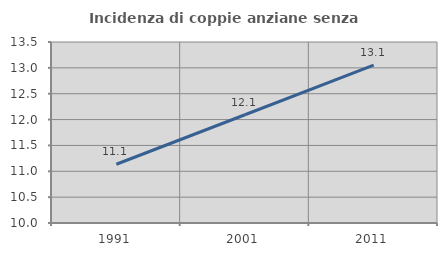
| Category | Incidenza di coppie anziane senza figli  |
|---|---|
| 1991.0 | 11.136 |
| 2001.0 | 12.093 |
| 2011.0 | 13.054 |